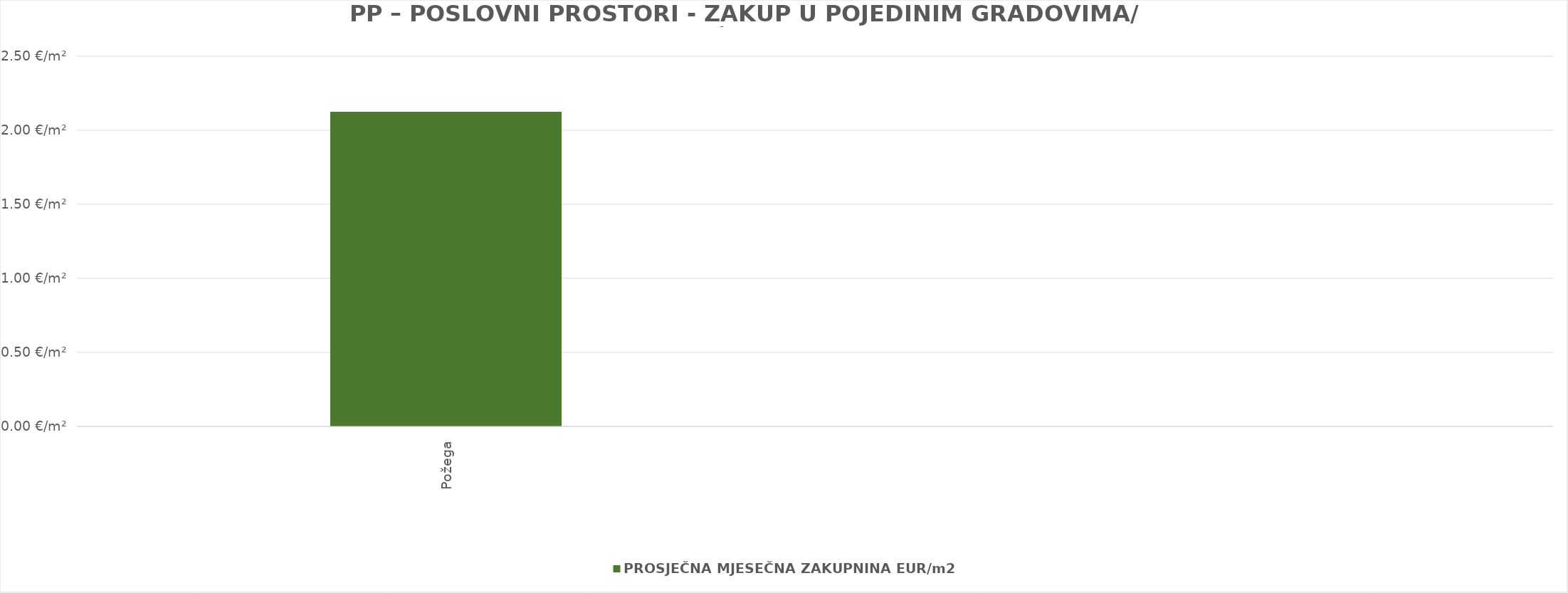
| Category | PROSJEČNA MJESEČNA ZAKUPNINA EUR/m2 |
|---|---|
| Požega | 1900-01-02 03:00:27 |